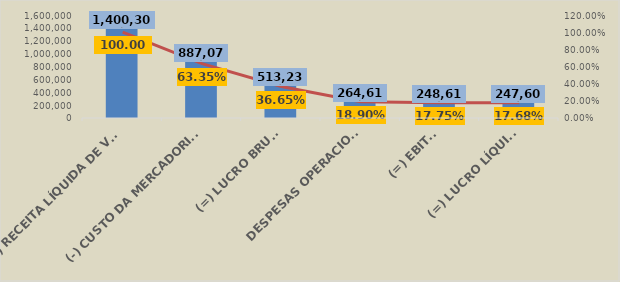
| Category | Em R$ 1 |
|---|---|
| (=) RECEITA LÍQUIDA DE VENDAS | 1400304.515 |
| (-) CUSTO DA MERCADORIA VENDIDA (CMV) | 887072.2 |
| (=) LUCRO BRUTO | 513232.315 |
| DESPESAS OPERACIONAIS | 264613.895 |
| (=) EBITDA | 248618.421 |
| (=) LUCRO LÍQUIDO | 247602.531 |